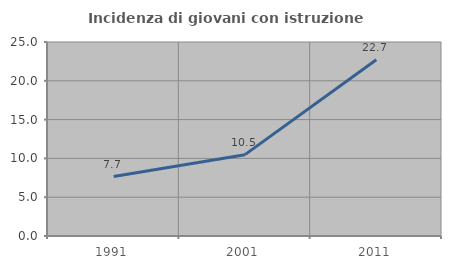
| Category | Incidenza di giovani con istruzione universitaria |
|---|---|
| 1991.0 | 7.663 |
| 2001.0 | 10.483 |
| 2011.0 | 22.705 |